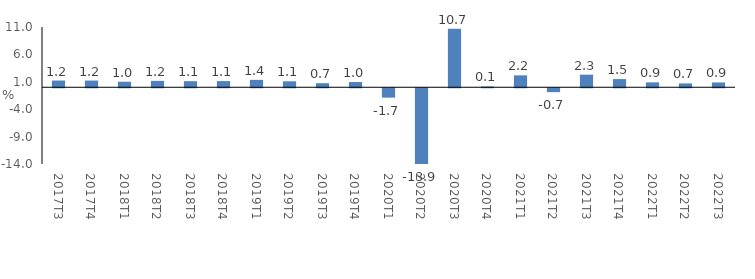
| Category | Series 0 |
|---|---|
| 2017Τ3 | 1.233 |
| 2017Τ4 | 1.227 |
| 2018Τ1 | 1.015 |
| 2018Τ2 | 1.169 |
| 2018Τ3 | 1.113 |
| 2018Τ4 | 1.128 |
| 2019Τ1 | 1.353 |
| 2019Τ2 | 1.092 |
| 2019Τ3 | 0.742 |
| 2019Τ4 | 0.958 |
| 2020Τ1 | -1.708 |
| 2020Τ2 | -13.879 |
| 2020Τ3 | 10.677 |
| 2020Τ4 | 0.149 |
| 2021Τ1 | 2.177 |
| 2021Τ2 | -0.703 |
| 2021Τ3 | 2.301 |
| 2021Τ4 | 1.498 |
| 2022Τ1 | 0.897 |
| 2022Τ2 | 0.705 |
| 2022Τ3 | 0.883 |